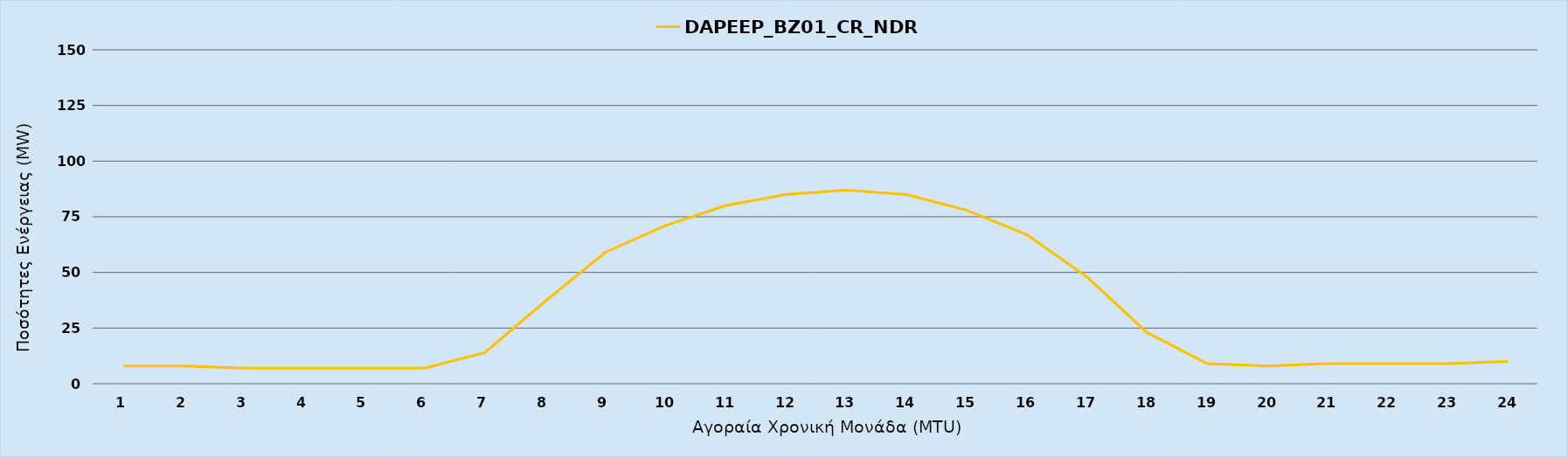
| Category | DAPEEP_BZ01_CR_NDR |
|---|---|
| 0 | 8 |
| 1 | 8 |
| 2 | 7 |
| 3 | 7 |
| 4 | 7 |
| 5 | 7 |
| 6 | 14 |
| 7 | 37 |
| 8 | 59 |
| 9 | 71 |
| 10 | 80 |
| 11 | 85 |
| 12 | 87 |
| 13 | 85 |
| 14 | 78 |
| 15 | 67 |
| 16 | 48 |
| 17 | 23 |
| 18 | 9 |
| 19 | 8 |
| 20 | 9 |
| 21 | 9 |
| 22 | 9 |
| 23 | 10 |